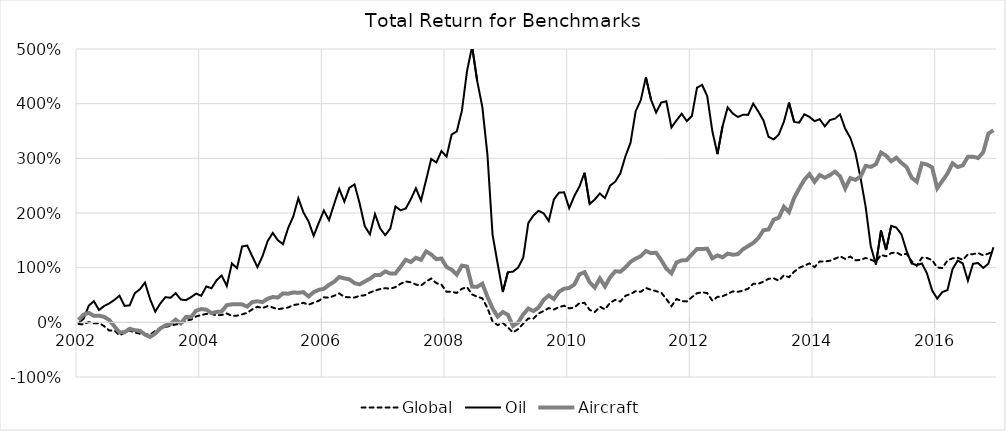
| Category | Global | Oil | Aircraft |
|---|---|---|---|
| 2002-01-31 | -0.031 | -0.016 | 0.042 |
| 2002-02-28 | -0.038 | 0.069 | 0.142 |
| 2002-03-31 | 0.007 | 0.305 | 0.174 |
| 2002-04-30 | -0.018 | 0.387 | 0.119 |
| 2002-05-31 | -0.015 | 0.225 | 0.12 |
| 2002-06-30 | -0.069 | 0.299 | 0.101 |
| 2002-07-31 | -0.15 | 0.346 | 0.043 |
| 2002-08-31 | -0.148 | 0.409 | -0.072 |
| 2002-09-30 | -0.237 | 0.486 | -0.184 |
| 2002-10-31 | -0.191 | 0.301 | -0.182 |
| 2002-11-30 | -0.149 | 0.311 | -0.119 |
| 2002-12-31 | -0.186 | 0.532 | -0.144 |
| 2003-01-31 | -0.208 | 0.605 | -0.153 |
| 2003-02-28 | -0.222 | 0.727 | -0.225 |
| 2003-03-31 | -0.225 | 0.423 | -0.268 |
| 2003-04-30 | -0.157 | 0.196 | -0.205 |
| 2003-05-31 | -0.102 | 0.345 | -0.11 |
| 2003-06-30 | -0.084 | 0.461 | -0.057 |
| 2003-07-31 | -0.064 | 0.449 | -0.027 |
| 2003-08-31 | -0.038 | 0.534 | 0.048 |
| 2003-09-30 | -0.026 | 0.417 | -0.021 |
| 2003-10-31 | 0.032 | 0.406 | 0.096 |
| 2003-11-30 | 0.049 | 0.459 | 0.096 |
| 2003-12-31 | 0.108 | 0.526 | 0.213 |
| 2004-01-31 | 0.133 | 0.486 | 0.243 |
| 2004-02-28 | 0.155 | 0.657 | 0.232 |
| 2004-03-31 | 0.154 | 0.622 | 0.169 |
| 2004-04-30 | 0.127 | 0.769 | 0.19 |
| 2004-05-31 | 0.135 | 0.857 | 0.198 |
| 2004-06-30 | 0.162 | 0.665 | 0.314 |
| 2004-07-31 | 0.118 | 1.077 | 0.329 |
| 2004-08-31 | 0.122 | 0.991 | 0.332 |
| 2004-09-30 | 0.145 | 1.387 | 0.328 |
| 2004-10-31 | 0.175 | 1.405 | 0.288 |
| 2004-11-30 | 0.238 | 1.205 | 0.372 |
| 2004-12-31 | 0.285 | 1.01 | 0.385 |
| 2005-01-31 | 0.26 | 1.212 | 0.37 |
| 2005-02-28 | 0.298 | 1.488 | 0.432 |
| 2005-03-31 | 0.272 | 1.636 | 0.463 |
| 2005-04-30 | 0.239 | 1.501 | 0.454 |
| 2005-05-31 | 0.256 | 1.43 | 0.53 |
| 2005-06-30 | 0.271 | 1.723 | 0.523 |
| 2005-07-31 | 0.316 | 1.934 | 0.547 |
| 2005-08-31 | 0.33 | 2.27 | 0.541 |
| 2005-09-30 | 0.357 | 2.011 | 0.552 |
| 2005-10-31 | 0.321 | 1.845 | 0.473 |
| 2005-11-30 | 0.36 | 1.582 | 0.552 |
| 2005-12-31 | 0.395 | 1.821 | 0.594 |
| 2006-01-31 | 0.457 | 2.045 | 0.613 |
| 2006-02-28 | 0.451 | 1.871 | 0.685 |
| 2006-03-31 | 0.486 | 2.162 | 0.742 |
| 2006-04-30 | 0.529 | 2.442 | 0.828 |
| 2006-05-31 | 0.466 | 2.208 | 0.804 |
| 2006-06-30 | 0.457 | 2.463 | 0.786 |
| 2006-07-31 | 0.453 | 2.522 | 0.717 |
| 2006-08-31 | 0.486 | 2.174 | 0.694 |
| 2006-09-30 | 0.495 | 1.759 | 0.748 |
| 2006-10-31 | 0.544 | 1.609 | 0.797 |
| 2006-11-30 | 0.58 | 1.981 | 0.867 |
| 2006-12-31 | 0.609 | 1.719 | 0.865 |
| 2007-01-31 | 0.624 | 1.594 | 0.931 |
| 2007-02-28 | 0.616 | 1.716 | 0.892 |
| 2007-03-31 | 0.644 | 2.12 | 0.895 |
| 2007-04-30 | 0.705 | 2.049 | 1.016 |
| 2007-05-31 | 0.747 | 2.08 | 1.144 |
| 2007-06-30 | 0.733 | 2.25 | 1.103 |
| 2007-07-31 | 0.692 | 2.453 | 1.18 |
| 2007-08-31 | 0.672 | 2.227 | 1.144 |
| 2007-09-30 | 0.746 | 2.604 | 1.298 |
| 2007-10-31 | 0.802 | 2.988 | 1.242 |
| 2007-11-30 | 0.718 | 2.923 | 1.154 |
| 2007-12-31 | 0.69 | 3.133 | 1.168 |
| 2008-01-31 | 0.558 | 3.031 | 1.012 |
| 2008-02-28 | 0.557 | 3.436 | 0.962 |
| 2008-03-31 | 0.538 | 3.492 | 0.872 |
| 2008-04-30 | 0.614 | 3.869 | 1.037 |
| 2008-05-31 | 0.643 | 4.594 | 1.02 |
| 2008-06-30 | 0.51 | 5.046 | 0.654 |
| 2008-07-31 | 0.469 | 4.412 | 0.649 |
| 2008-08-31 | 0.438 | 3.942 | 0.708 |
| 2008-09-30 | 0.262 | 3.065 | 0.468 |
| 2008-10-31 | 0.016 | 1.605 | 0.255 |
| 2008-11-30 | -0.051 | 1.071 | 0.105 |
| 2008-12-31 | -0.009 | 0.555 | 0.189 |
| 2009-01-31 | -0.094 | 0.917 | 0.138 |
| 2009-02-28 | -0.184 | 0.927 | -0.067 |
| 2009-03-31 | -0.125 | 1.001 | -0.006 |
| 2009-04-30 | -0.025 | 1.182 | 0.145 |
| 2009-05-31 | 0.072 | 1.819 | 0.253 |
| 2009-06-30 | 0.069 | 1.954 | 0.207 |
| 2009-07-31 | 0.161 | 2.04 | 0.271 |
| 2009-08-31 | 0.208 | 1.993 | 0.411 |
| 2009-09-30 | 0.261 | 1.854 | 0.49 |
| 2009-10-31 | 0.234 | 2.248 | 0.426 |
| 2009-11-30 | 0.279 | 2.372 | 0.56 |
| 2009-12-31 | 0.304 | 2.378 | 0.616 |
| 2010-01-31 | 0.255 | 2.087 | 0.629 |
| 2010-02-28 | 0.271 | 2.311 | 0.692 |
| 2010-03-31 | 0.351 | 2.484 | 0.876 |
| 2010-04-30 | 0.357 | 2.736 | 0.917 |
| 2010-05-31 | 0.227 | 2.164 | 0.734 |
| 2010-06-30 | 0.189 | 2.248 | 0.636 |
| 2010-07-31 | 0.286 | 2.359 | 0.804 |
| 2010-08-31 | 0.236 | 2.272 | 0.657 |
| 2010-09-30 | 0.358 | 2.5 | 0.824 |
| 2010-10-31 | 0.411 | 2.573 | 0.935 |
| 2010-11-30 | 0.381 | 2.726 | 0.926 |
| 2010-12-31 | 0.486 | 3.038 | 1.005 |
| 2011-01-31 | 0.517 | 3.287 | 1.106 |
| 2011-02-28 | 0.57 | 3.862 | 1.166 |
| 2011-03-31 | 0.559 | 4.064 | 1.212 |
| 2011-04-30 | 0.629 | 4.482 | 1.305 |
| 2011-05-31 | 0.595 | 4.074 | 1.266 |
| 2011-06-30 | 0.57 | 3.838 | 1.274 |
| 2011-07-31 | 0.544 | 4.02 | 1.138 |
| 2011-08-31 | 0.428 | 4.044 | 0.983 |
| 2011-09-30 | 0.296 | 3.565 | 0.897 |
| 2011-10-31 | 0.426 | 3.695 | 1.096 |
| 2011-11-30 | 0.389 | 3.816 | 1.133 |
| 2011-12-31 | 0.383 | 3.68 | 1.139 |
| 2012-01-31 | 0.46 | 3.774 | 1.245 |
| 2012-02-28 | 0.532 | 4.293 | 1.341 |
| 2012-03-31 | 0.551 | 4.344 | 1.342 |
| 2012-04-30 | 0.534 | 4.138 | 1.347 |
| 2012-05-31 | 0.397 | 3.497 | 1.171 |
| 2012-06-30 | 0.465 | 3.077 | 1.225 |
| 2012-07-31 | 0.478 | 3.586 | 1.189 |
| 2012-08-31 | 0.519 | 3.932 | 1.257 |
| 2012-09-30 | 0.566 | 3.82 | 1.236 |
| 2012-10-31 | 0.559 | 3.756 | 1.247 |
| 2012-11-30 | 0.579 | 3.797 | 1.338 |
| 2012-12-31 | 0.616 | 3.795 | 1.394 |
| 2013-01-31 | 0.704 | 4 | 1.452 |
| 2013-02-28 | 0.705 | 3.855 | 1.541 |
| 2013-03-31 | 0.744 | 3.694 | 1.685 |
| 2013-04-30 | 0.797 | 3.394 | 1.699 |
| 2013-05-31 | 0.807 | 3.346 | 1.878 |
| 2013-06-30 | 0.761 | 3.435 | 1.913 |
| 2013-07-31 | 0.859 | 3.669 | 2.114 |
| 2013-08-31 | 0.826 | 4.018 | 2.017 |
| 2013-09-30 | 0.926 | 3.667 | 2.275 |
| 2013-10-31 | 0.998 | 3.653 | 2.448 |
| 2013-11-30 | 1.034 | 3.806 | 2.608 |
| 2013-12-31 | 1.079 | 3.758 | 2.711 |
| 2014-01-31 | 1.01 | 3.681 | 2.569 |
| 2014-02-28 | 1.111 | 3.716 | 2.694 |
| 2014-03-31 | 1.114 | 3.585 | 2.646 |
| 2014-04-30 | 1.126 | 3.701 | 2.693 |
| 2014-05-31 | 1.163 | 3.726 | 2.757 |
| 2014-06-30 | 1.207 | 3.805 | 2.67 |
| 2014-07-31 | 1.161 | 3.541 | 2.449 |
| 2014-08-31 | 1.203 | 3.376 | 2.638 |
| 2014-09-30 | 1.135 | 3.097 | 2.605 |
| 2014-10-31 | 1.142 | 2.642 | 2.669 |
| 2014-11-30 | 1.178 | 2.111 | 2.86 |
| 2014-12-31 | 1.146 | 1.392 | 2.844 |
| 2015-01-31 | 1.109 | 1.056 | 2.892 |
| 2015-02-28 | 1.234 | 1.678 | 3.106 |
| 2015-03-31 | 1.207 | 1.323 | 3.048 |
| 2015-04-30 | 1.267 | 1.765 | 2.946 |
| 2015-05-31 | 1.278 | 1.733 | 3.011 |
| 2015-06-30 | 1.23 | 1.61 | 2.916 |
| 2015-07-31 | 1.256 | 1.306 | 2.841 |
| 2015-08-31 | 1.117 | 1.076 | 2.646 |
| 2015-09-30 | 1.034 | 1.046 | 2.571 |
| 2015-10-31 | 1.183 | 1.077 | 2.908 |
| 2015-11-30 | 1.176 | 0.892 | 2.887 |
| 2015-12-31 | 1.138 | 0.584 | 2.835 |
| 2016-01-31 | 1.003 | 0.434 | 2.456 |
| 2016-02-28 | 0.993 | 0.554 | 2.587 |
| 2016-03-31 | 1.131 | 0.589 | 2.721 |
| 2016-04-30 | 1.171 | 0.974 | 2.91 |
| 2016-05-31 | 1.181 | 1.13 | 2.84 |
| 2016-06-30 | 1.145 | 1.077 | 2.871 |
| 2016-07-31 | 1.241 | 0.762 | 3.028 |
| 2016-08-31 | 1.248 | 1.072 | 3.031 |
| 2016-09-30 | 1.268 | 1.084 | 3.005 |
| 2016-10-31 | 1.225 | 0.996 | 3.109 |
| 2016-11-30 | 1.256 | 1.071 | 3.452 |
| 2016-12-31 | 1.308 | 1.373 | 3.514 |